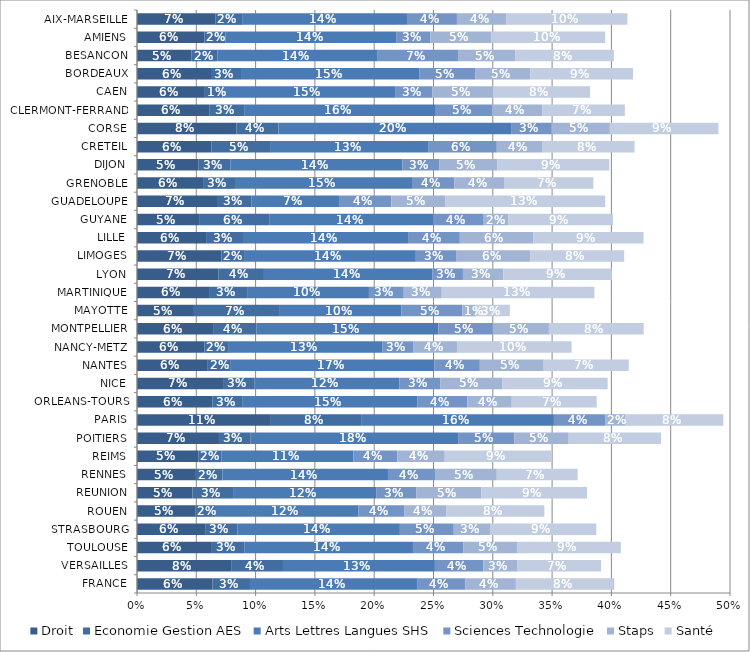
| Category | Droit | Economie Gestion AES | Arts Lettres Langues SHS | Sciences Technologie | Staps | Santé |
|---|---|---|---|---|---|---|
| AIX-MARSEILLE | 0.066 | 0.023 | 0.139 | 0.042 | 0.041 | 0.102 |
| AMIENS | 0.057 | 0.018 | 0.144 | 0.029 | 0.051 | 0.096 |
| BESANCON | 0.046 | 0.022 | 0.135 | 0.068 | 0.048 | 0.083 |
| BORDEAUX | 0.062 | 0.025 | 0.151 | 0.047 | 0.047 | 0.086 |
| CAEN | 0.057 | 0.015 | 0.146 | 0.032 | 0.051 | 0.082 |
| CLERMONT-FERRAND | 0.061 | 0.029 | 0.162 | 0.047 | 0.042 | 0.07 |
| CORSE | 0.084 | 0.035 | 0.196 | 0.034 | 0.049 | 0.092 |
| CRETEIL | 0.063 | 0.049 | 0.134 | 0.057 | 0.039 | 0.078 |
| DIJON | 0.052 | 0.027 | 0.145 | 0.031 | 0.049 | 0.095 |
| GRENOBLE | 0.056 | 0.027 | 0.149 | 0.036 | 0.042 | 0.075 |
| GUADELOUPE | 0.068 | 0.028 | 0.074 | 0.044 | 0.046 | 0.135 |
| GUYANE | 0.053 | 0.058 | 0.138 | 0.043 | 0.021 | 0.088 |
| LILLE | 0.058 | 0.031 | 0.14 | 0.043 | 0.062 | 0.093 |
| LIMOGES | 0.071 | 0.019 | 0.145 | 0.034 | 0.062 | 0.079 |
| LYON | 0.069 | 0.038 | 0.142 | 0.026 | 0.034 | 0.092 |
| MARTINIQUE | 0.061 | 0.032 | 0.103 | 0.029 | 0.032 | 0.129 |
| MAYOTTE | 0.048 | 0.072 | 0.103 | 0.051 | 0.011 | 0.029 |
| MONTPELLIER | 0.064 | 0.037 | 0.153 | 0.046 | 0.047 | 0.08 |
| NANCY-METZ | 0.057 | 0.021 | 0.13 | 0.026 | 0.037 | 0.096 |
| NANTES | 0.06 | 0.019 | 0.172 | 0.038 | 0.054 | 0.072 |
| NICE | 0.073 | 0.026 | 0.122 | 0.035 | 0.052 | 0.089 |
| ORLEANS-TOURS | 0.064 | 0.026 | 0.147 | 0.042 | 0.037 | 0.072 |
| PARIS | 0.113 | 0.076 | 0.163 | 0.043 | 0.017 | 0.083 |
| POITIERS | 0.069 | 0.027 | 0.175 | 0.047 | 0.046 | 0.078 |
| REIMS | 0.052 | 0.02 | 0.111 | 0.037 | 0.04 | 0.09 |
| RENNES | 0.05 | 0.022 | 0.139 | 0.04 | 0.052 | 0.068 |
| REUNION | 0.047 | 0.034 | 0.121 | 0.033 | 0.055 | 0.089 |
| ROUEN | 0.049 | 0.017 | 0.121 | 0.039 | 0.035 | 0.083 |
| STRASBOURG | 0.057 | 0.027 | 0.137 | 0.045 | 0.031 | 0.089 |
| TOULOUSE | 0.062 | 0.028 | 0.142 | 0.042 | 0.045 | 0.088 |
| VERSAILLES | 0.079 | 0.044 | 0.128 | 0.041 | 0.029 | 0.07 |
| FRANCE | 0.064 | 0.032 | 0.141 | 0.041 | 0.042 | 0.083 |